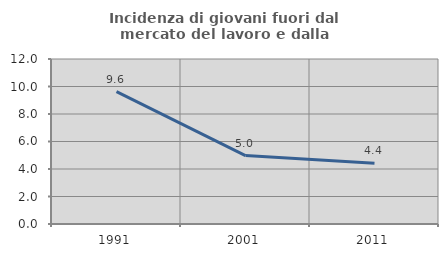
| Category | Incidenza di giovani fuori dal mercato del lavoro e dalla formazione  |
|---|---|
| 1991.0 | 9.63 |
| 2001.0 | 4.975 |
| 2011.0 | 4.42 |